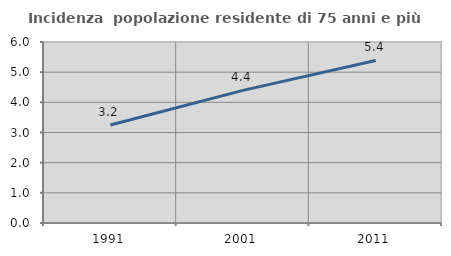
| Category | Incidenza  popolazione residente di 75 anni e più |
|---|---|
| 1991.0 | 3.248 |
| 2001.0 | 4.396 |
| 2011.0 | 5.389 |